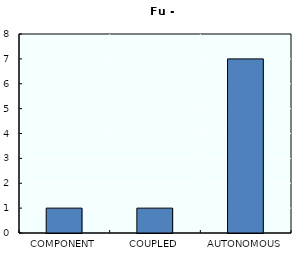
| Category | Series 0 |
|---|---|
| COMPONENT | 1 |
| COUPLED | 1 |
| AUTONOMOUS | 7 |